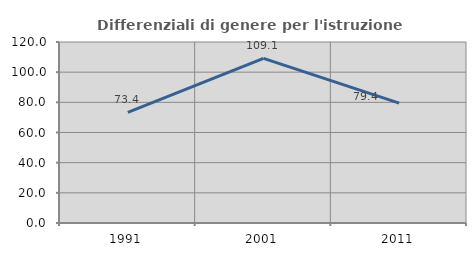
| Category | Differenziali di genere per l'istruzione superiore |
|---|---|
| 1991.0 | 73.351 |
| 2001.0 | 109.131 |
| 2011.0 | 79.445 |